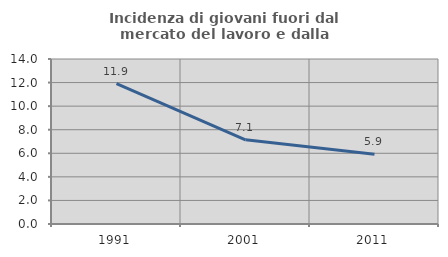
| Category | Incidenza di giovani fuori dal mercato del lavoro e dalla formazione  |
|---|---|
| 1991.0 | 11.905 |
| 2001.0 | 7.143 |
| 2011.0 | 5.926 |